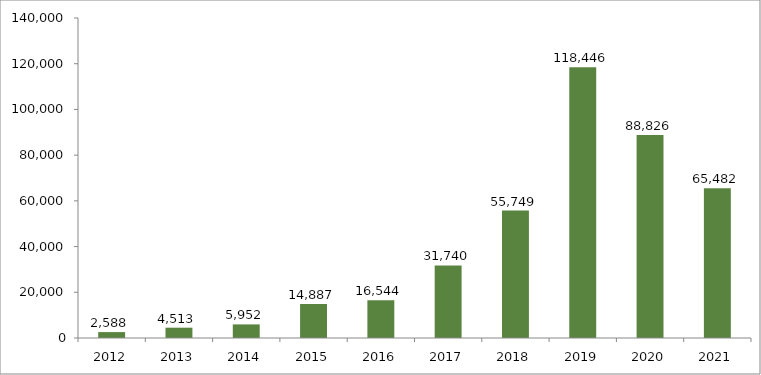
| Category | Solicitudes |
|---|---|
| 2012.0 | 2588 |
| 2013.0 | 4513 |
| 2014.0 | 5952 |
| 2015.0 | 14887 |
| 2016.0 | 16544 |
| 2017.0 | 31740 |
| 2018.0 | 55749 |
| 2019.0 | 118446 |
| 2020.0 | 88826 |
| 2021.0 | 65482 |